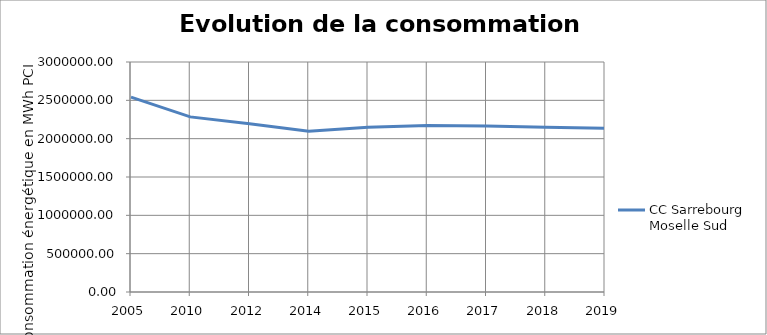
| Category | CC Sarrebourg Moselle Sud |
|---|---|
| 2005.0 | 2542463.507 |
| 2010.0 | 2284289.049 |
| 2012.0 | 2195432.753 |
| 2014.0 | 2098179.728 |
| 2015.0 | 2149333.671 |
| 2016.0 | 2170873.06 |
| 2017.0 | 2165280.406 |
| 2018.0 | 2150314.221 |
| 2019.0 | 2135037.128 |